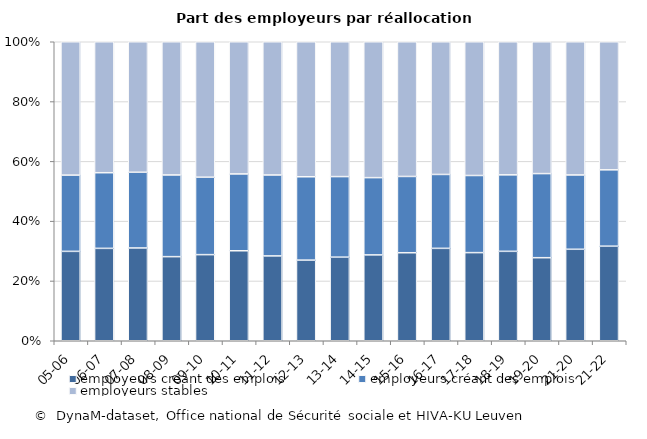
| Category | employeurs créant des emplois | employeurs stables |
|---|---|---|
| 21-22 | 25.533 | 42.835 |
| 21-20 | 24.861 | 44.547 |
| 19-20 | 28.127 | 44.095 |
| 18-19 | 25.58 | 44.513 |
| 17-18 | 25.792 | 44.732 |
| 16-17 | 24.711 | 44.381 |
| 15-16 | 25.513 | 45.048 |
| 14-15 | 25.839 | 45.448 |
| 13-14 | 26.941 | 45.097 |
| 12-13 | 27.9 | 45.2 |
| 11-12 | 27.1 | 44.6 |
| 10-11 | 25.7 | 44.2 |
| 09-10 | 25.9 | 45.3 |
| 08-09 | 27.3 | 44.5 |
| 07-08 | 25.3 | 43.6 |
| 06-07 | 25.3 | 43.8 |
| 05-06 | 25.5 | 44.6 |